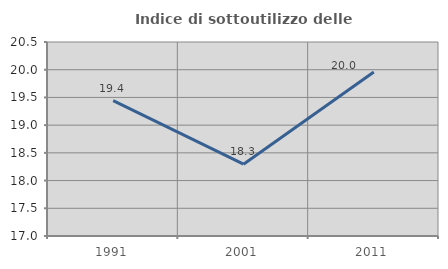
| Category | Indice di sottoutilizzo delle abitazioni  |
|---|---|
| 1991.0 | 19.442 |
| 2001.0 | 18.296 |
| 2011.0 | 19.957 |